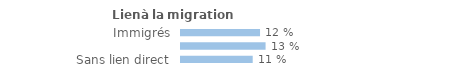
| Category | Series 0 |
|---|---|
| Immigrés | 0.117 |
| Descendants d'immigré(s) | 0.126 |
| Sans lien direct | 0.106 |